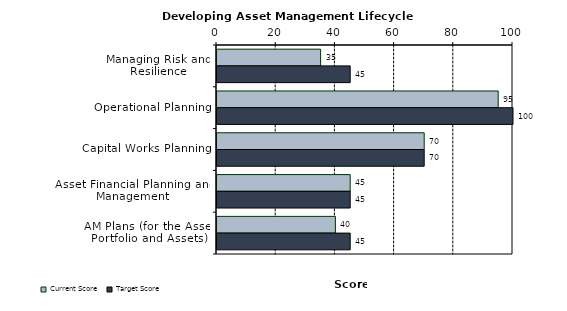
| Category | Current Score | Target Score |
|---|---|---|
| Managing Risk and Resilience | 35 | 45 |
| Operational Planning | 95 | 100 |
| Capital Works Planning | 70 | 70 |
| Asset Financial Planning and Management | 45 | 45 |
| AM Plans (for the Asset Portfolio and Assets) | 40 | 45 |